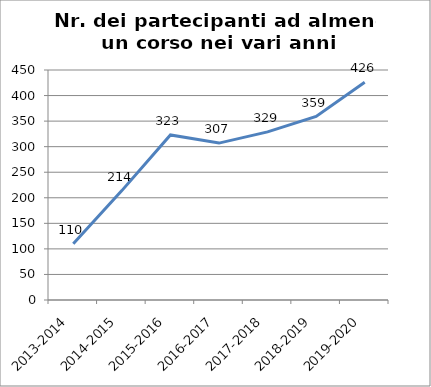
| Category | Nr. Partecipanti ad almeno un Corso |
|---|---|
| 2013-2014 | 110 |
| 2014-2015 | 214 |
| 2015-2016 | 323 |
| 2016-2017 | 307 |
| 2017-2018 | 329 |
| 2018-2019 | 359 |
| 2019-2020 | 426 |